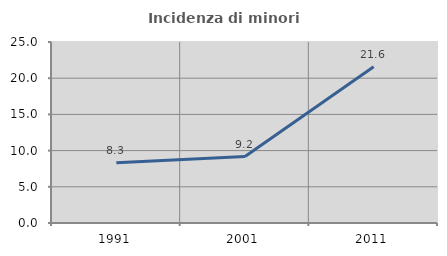
| Category | Incidenza di minori stranieri |
|---|---|
| 1991.0 | 8.333 |
| 2001.0 | 9.184 |
| 2011.0 | 21.581 |